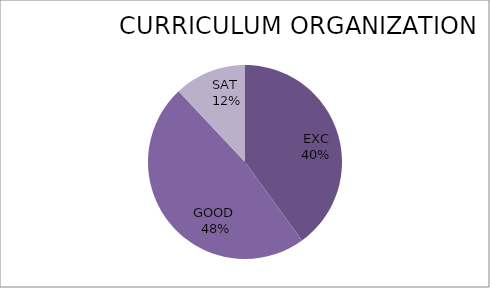
| Category | Series 0 |
|---|---|
| EXC | 40 |
| GOOD  | 48 |
| SAT  | 12 |